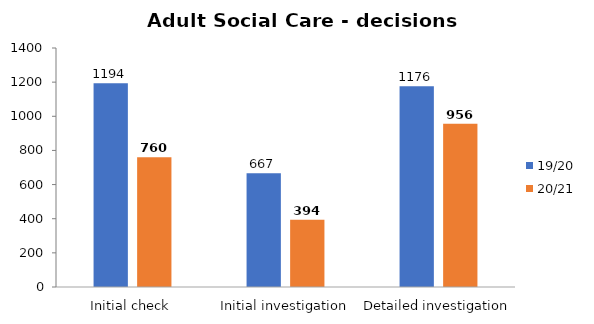
| Category | 19/20 | 20/21 |
|---|---|---|
| Initial check | 1194 | 760 |
| Initial investigation | 667 | 394 |
| Detailed investigation | 1176 | 956 |